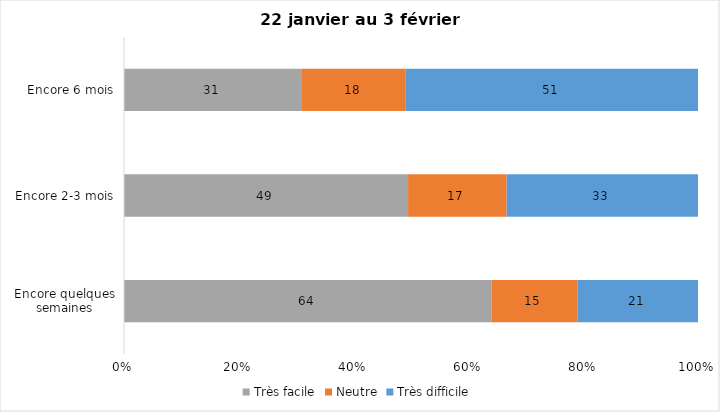
| Category | Très facile | Neutre | Très difficile |
|---|---|---|---|
| Encore quelques semaines | 64 | 15 | 21 |
| Encore 2-3 mois | 49 | 17 | 33 |
| Encore 6 mois | 31 | 18 | 51 |